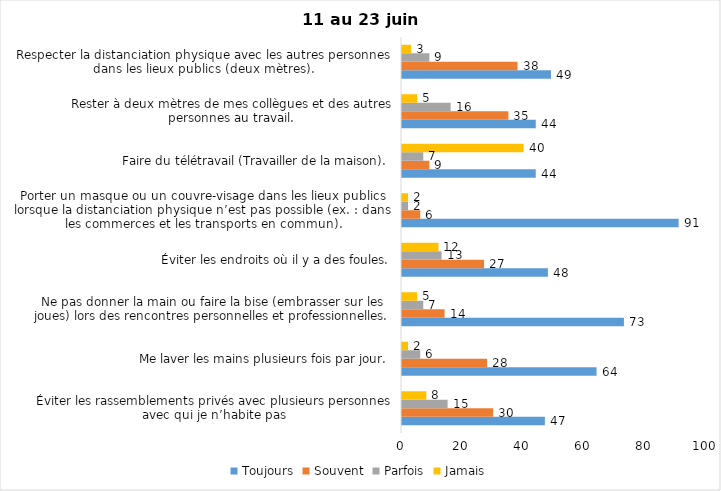
| Category | Toujours | Souvent | Parfois | Jamais |
|---|---|---|---|---|
| Éviter les rassemblements privés avec plusieurs personnes avec qui je n’habite pas | 47 | 30 | 15 | 8 |
| Me laver les mains plusieurs fois par jour. | 64 | 28 | 6 | 2 |
| Ne pas donner la main ou faire la bise (embrasser sur les joues) lors des rencontres personnelles et professionnelles. | 73 | 14 | 7 | 5 |
| Éviter les endroits où il y a des foules. | 48 | 27 | 13 | 12 |
| Porter un masque ou un couvre-visage dans les lieux publics lorsque la distanciation physique n’est pas possible (ex. : dans les commerces et les transports en commun). | 91 | 6 | 2 | 2 |
| Faire du télétravail (Travailler de la maison). | 44 | 9 | 7 | 40 |
| Rester à deux mètres de mes collègues et des autres personnes au travail. | 44 | 35 | 16 | 5 |
| Respecter la distanciation physique avec les autres personnes dans les lieux publics (deux mètres). | 49 | 38 | 9 | 3 |